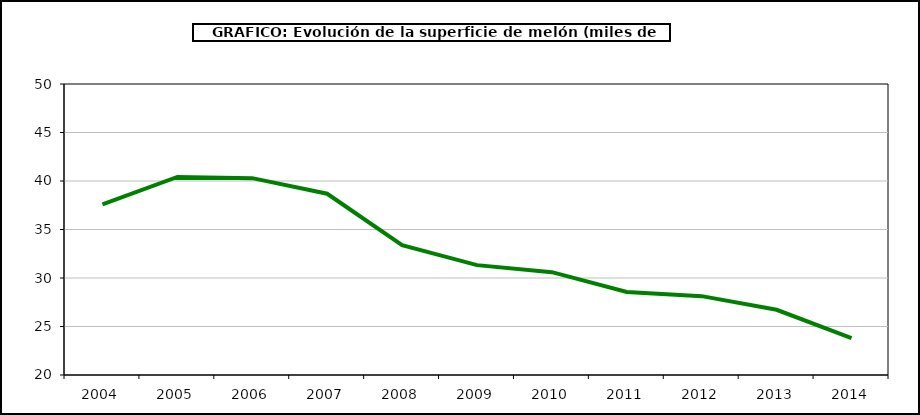
| Category | superficie |
|---|---|
| 2004.0 | 37.594 |
| 2005.0 | 40.423 |
| 2006.0 | 40.294 |
| 2007.0 | 38.688 |
| 2008.0 | 33.388 |
| 2009.0 | 31.327 |
| 2010.0 | 30.601 |
| 2011.0 | 28.561 |
| 2012.0 | 28.13 |
| 2013.0 | 26.723 |
| 2014.0 | 23.8 |